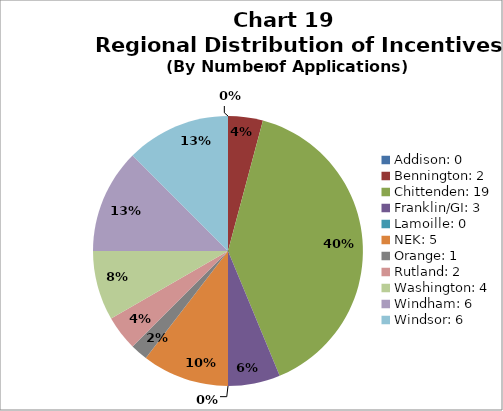
| Category | Series 0 | Series 1 | Series 2 |
|---|---|---|---|
| Addison: 0 | 0 | 0 |  |
| Bennington: 2 | 2 | 0.042 |  |
| Chittenden: 19 | 19 | 0.396 |  |
| Franklin/GI: 3 | 3 | 0.062 |  |
| Lamoille: 0 | 0 | 0 |  |
| NEK: 5 | 5 | 0.104 |  |
| Orange: 1 | 1 | 0.021 |  |
| Rutland: 2 | 2 | 0.042 |  |
| Washington: 4 | 4 | 0.083 |  |
| Windham: 6 | 6 | 0.125 |  |
| Windsor: 6 | 6 | 0.125 |  |